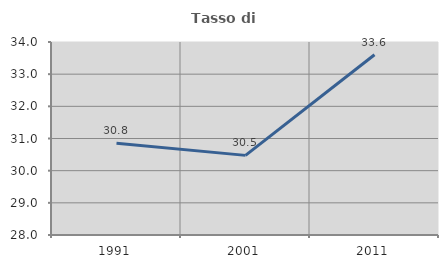
| Category | Tasso di occupazione   |
|---|---|
| 1991.0 | 30.849 |
| 2001.0 | 30.475 |
| 2011.0 | 33.604 |